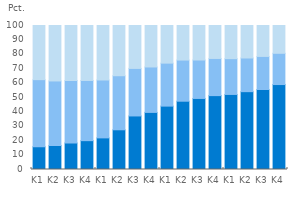
| Category | Kontantautomat | Kasse | Døgnboks |
|---|---|---|---|
| K1 | 15.789 | 46.602 | 37.609 |
| K2 | 16.658 | 44.826 | 38.516 |
| K3 | 18.425 | 43.388 | 38.187 |
| K4 | 20.032 | 41.808 | 38.161 |
| K1 | 21.96 | 40.201 | 37.839 |
| K2 | 27.584 | 37.528 | 34.888 |
| K3 | 37.19 | 33.009 | 29.801 |
| K4 | 39.65 | 31.55 | 28.8 |
| K1 | 44.019 | 29.849 | 26.131 |
| K2 | 47.423 | 28.579 | 23.998 |
| K3 | 49.344 | 26.69 | 23.966 |
| K4 | 51.306 | 25.81 | 22.884 |
| K1 | 52.126 | 24.848 | 23.026 |
| K2 | 54.053 | 23.384 | 22.563 |
| K3 | 55.538 | 22.989 | 21.473 |
| K4 | 58.995 | 21.702 | 19.303 |